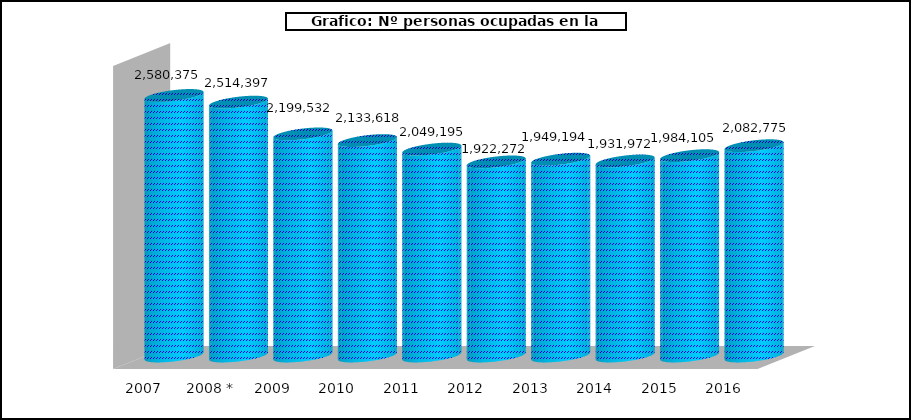
| Category |  Nº personas ocupadas |
|---|---|
| 2007 | 2580375 |
|  2008 * | 2514397 |
| 2009 | 2199532 |
| 2010 | 2133618 |
| 2011 | 2049195 |
| 2012 | 1922272 |
| 2013 | 1949194 |
| 2014 | 1931972 |
| 2015 | 1984105 |
| 2016 | 2082775 |